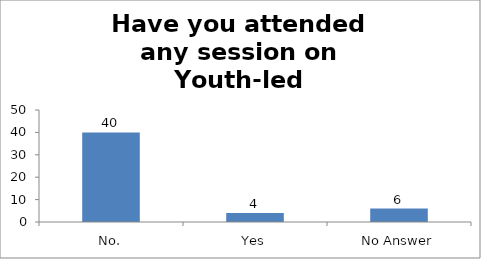
| Category | Have you attended any session on Youth-led Changemaking before? |
|---|---|
| No. | 40 |
| Yes | 4 |
| No Answer | 6 |